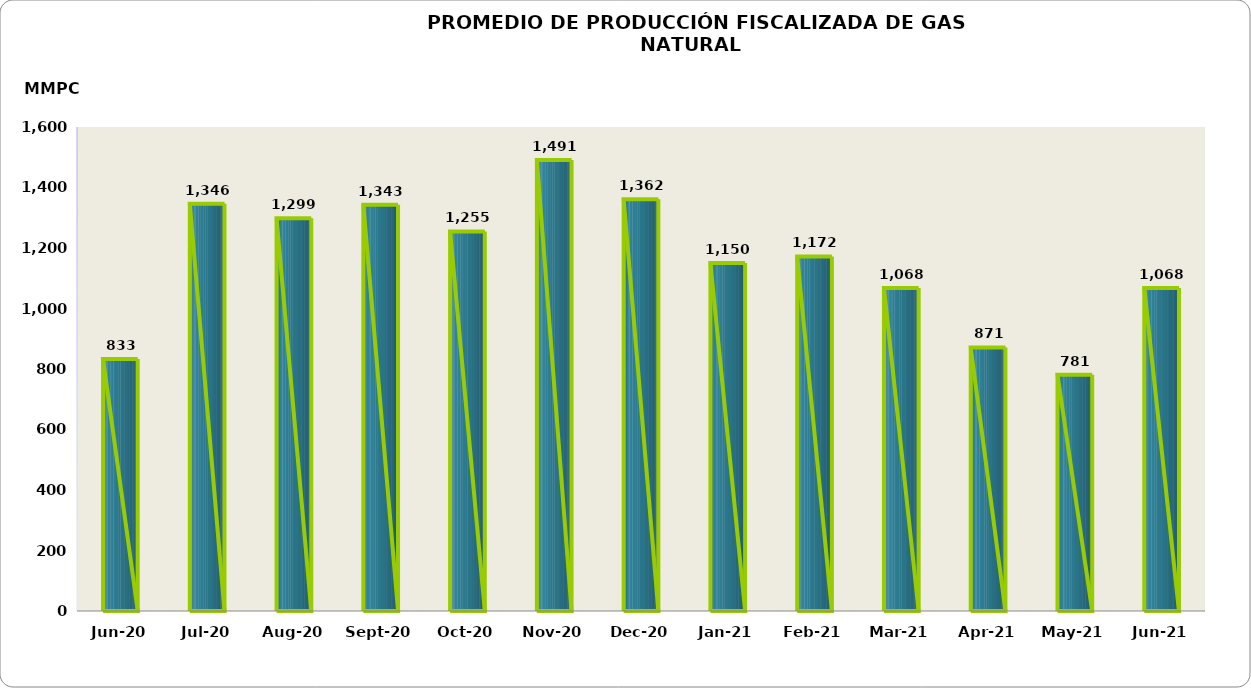
| Category | Series 0 |
|---|---|
| 2020-06-01 | 832774.501 |
| 2020-07-01 | 1346101.494 |
| 2020-08-01 | 1298655.154 |
| 2020-09-01 | 1342976.236 |
| 2020-10-01 | 1254828.351 |
| 2020-11-01 | 1490754.692 |
| 2020-12-01 | 1361515.502 |
| 2021-01-01 | 1150031.71 |
| 2021-02-01 | 1172289.733 |
| 2021-03-01 | 1067744.591 |
| 2021-04-01 | 871274.072 |
| 2021-05-01 | 780865.314 |
| 2021-06-01 | 1068128.403 |